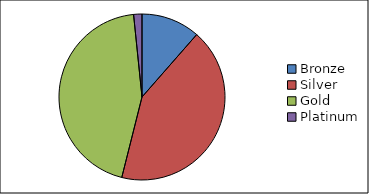
| Category | Total |
|---|---|
| Bronze | 254 |
| Silver | 942 |
| Gold | 986 |
| Platinum | 36 |